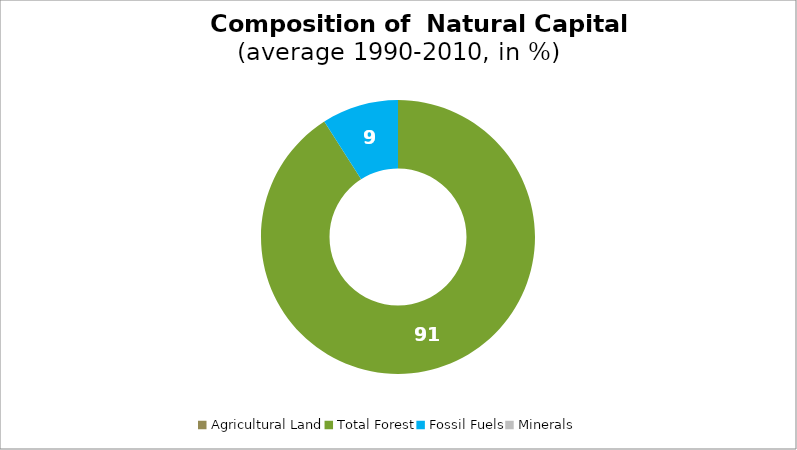
| Category | Series 0 |
|---|---|
| Agricultural Land | 0 |
| Total Forest | 90.957 |
| Fossil Fuels | 9.043 |
| Minerals | 0 |